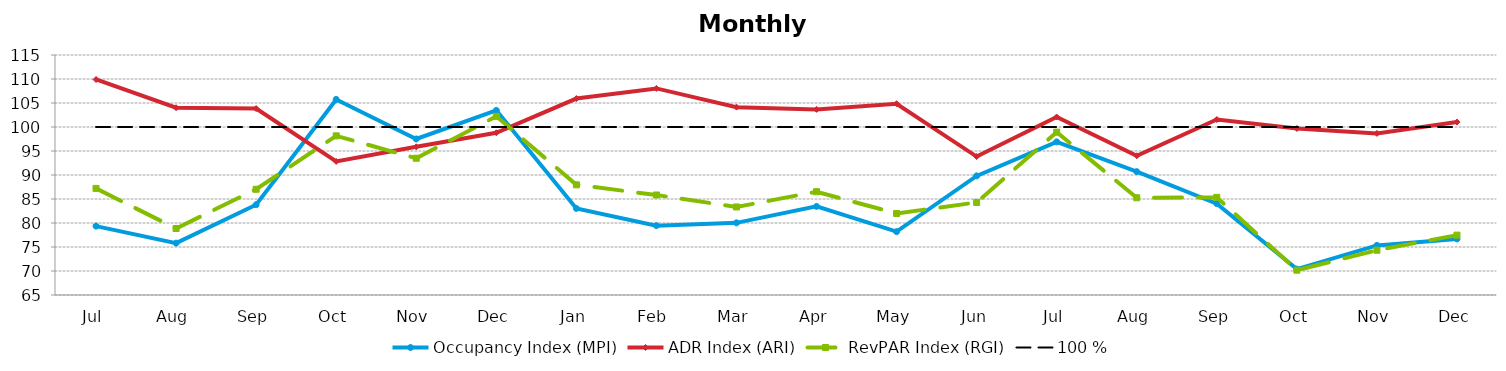
| Category | Occupancy Index (MPI) | ADR Index (ARI) | RevPAR Index (RGI) | 100 % |
|---|---|---|---|---|
| Jul | 79.353 | 109.899 | 87.209 | 100 |
| Aug | 75.809 | 104.016 | 78.854 | 100 |
| Sep | 83.812 | 103.839 | 87.029 | 100 |
| Oct | 105.746 | 92.826 | 98.16 | 100 |
| Nov | 97.508 | 95.877 | 93.487 | 100 |
| Dec | 103.467 | 98.797 | 102.223 | 100 |
| Jan | 83.036 | 105.923 | 87.955 | 100 |
| Feb | 79.453 | 108.037 | 85.839 | 100 |
| Mar | 80.03 | 104.139 | 83.342 | 100 |
| Apr | 83.459 | 103.669 | 86.521 | 100 |
| May | 78.194 | 104.848 | 81.986 | 100 |
| Jun | 89.815 | 93.839 | 84.282 | 100 |
| Jul | 96.902 | 102.089 | 98.926 | 100 |
| Aug | 90.694 | 94.007 | 85.259 | 100 |
| Sep | 84.031 | 101.554 | 85.337 | 100 |
| Oct | 70.389 | 99.695 | 70.174 | 100 |
| Nov | 75.33 | 98.67 | 74.328 | 100 |
| Dec | 76.684 | 101.028 | 77.473 | 100 |